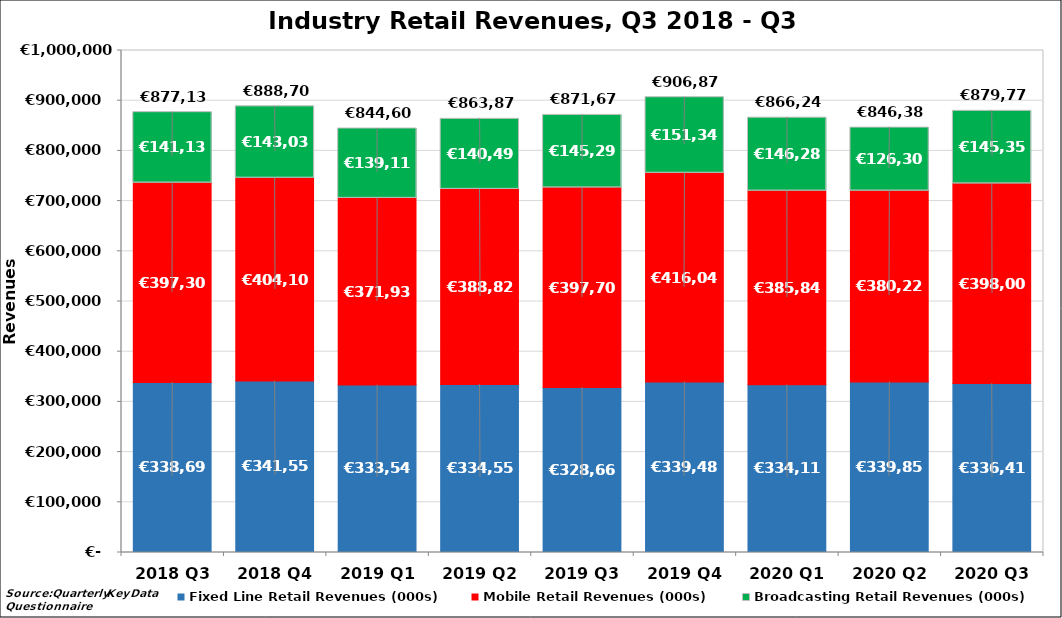
| Category | Fixed Line Retail Revenues (000s) | Mobile Retail Revenues (000s) | Broadcasting Retail Revenues (000s) |
|---|---|---|---|
| 2018 Q3 | 338692.364 | 397308.293 | 141136.874 |
| 2018 Q4 | 341555.412 | 404108.118 | 143038.444 |
| 2019 Q1 | 333546.469 | 371937.702 | 139116.768 |
| 2019 Q2 | 334555.661 | 388825.881 | 140493.699 |
| 2019 Q3 | 328666.506 | 397708.31 | 145297.666 |
| 2019 Q4 | 339487.178 | 416043.983 | 151346.492 |
| 2020 Q1 | 334116.414 | 385845.453 | 146283 |
| 2020 Q2 | 339854.93 | 380223 | 126307 |
| 2020 Q3 | 336418.251 | 398002 | 145352.467 |